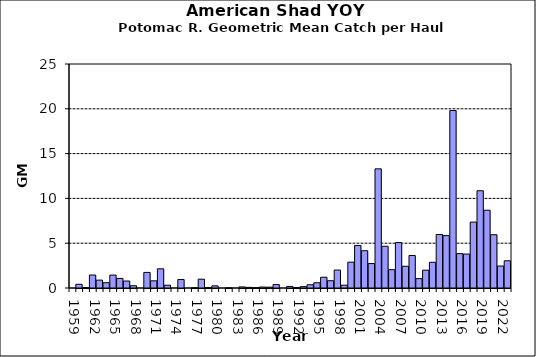
| Category | Series 0 |
|---|---|
| 1959.0 | 0 |
| 1960.0 | 0.414 |
| 1961.0 | 0.044 |
| 1962.0 | 1.448 |
| 1963.0 | 0.881 |
| 1964.0 | 0.589 |
| 1965.0 | 1.443 |
| 1966.0 | 1.07 |
| 1967.0 | 0.776 |
| 1968.0 | 0.254 |
| 1969.0 | 0 |
| 1970.0 | 1.739 |
| 1971.0 | 0.8 |
| 1972.0 | 2.143 |
| 1973.0 | 0.312 |
| 1974.0 | 0 |
| 1975.0 | 0.945 |
| 1976.0 | 0 |
| 1977.0 | 0.017 |
| 1978.0 | 0.985 |
| 1979.0 | 0.034 |
| 1980.0 | 0.237 |
| 1981.0 | 0 |
| 1982.0 | 0.017 |
| 1983.0 | 0 |
| 1984.0 | 0.121 |
| 1985.0 | 0.071 |
| 1986.0 | 0.034 |
| 1987.0 | 0.107 |
| 1988.0 | 0.092 |
| 1989.0 | 0.379 |
| 1990.0 | 0 |
| 1991.0 | 0.175 |
| 1992.0 | 0.051 |
| 1993.0 | 0.15 |
| 1994.0 | 0.362 |
| 1995.0 | 0.586 |
| 1996.0 | 1.201 |
| 1997.0 | 0.812 |
| 1998.0 | 2.002 |
| 1999.0 | 0.312 |
| 2000.0 | 2.885 |
| 2001.0 | 4.745 |
| 2002.0 | 4.161 |
| 2003.0 | 2.727 |
| 2004.0 | 13.3 |
| 2005.0 | 4.658 |
| 2006.0 | 2.042 |
| 2007.0 | 5.068 |
| 2008.0 | 2.423 |
| 2009.0 | 3.628 |
| 2010.0 | 1.045 |
| 2011.0 | 1.989 |
| 2012.0 | 2.87 |
| 2013.0 | 5.969 |
| 2014.0 | 5.846 |
| 2015.0 | 19.808 |
| 2016.0 | 3.837 |
| 2017.0 | 3.789 |
| 2018.0 | 7.356 |
| 2019.0 | 10.856 |
| 2020.0 | 8.68 |
| 2021.0 | 5.946 |
| 2022.0 | 2.452 |
| 2023.0 | 3.036 |